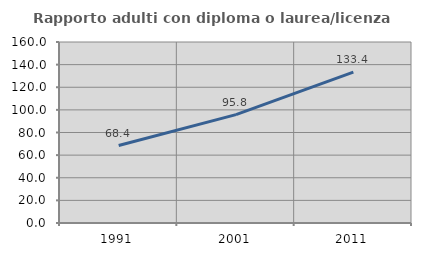
| Category | Rapporto adulti con diploma o laurea/licenza media  |
|---|---|
| 1991.0 | 68.445 |
| 2001.0 | 95.787 |
| 2011.0 | 133.44 |